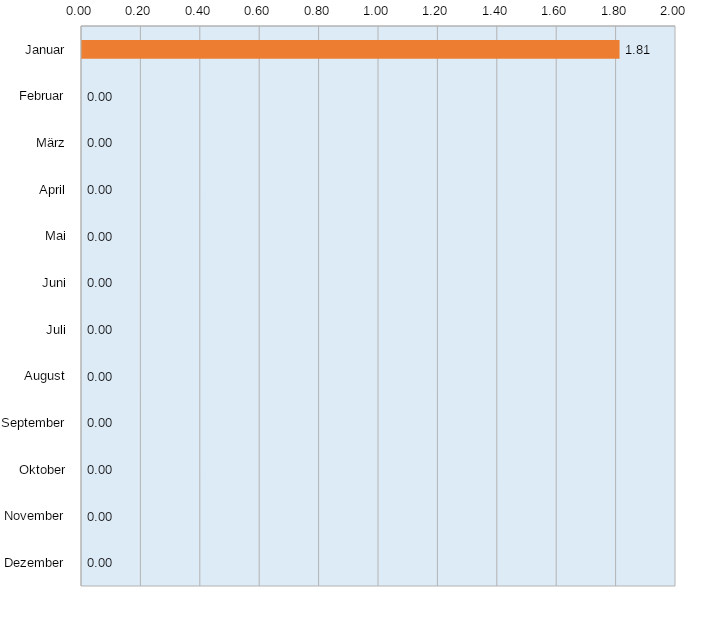
| Category | Werte im Ø |
|---|---|
| Januar | 1.81 |
| Februar | 0 |
| März | 0 |
| April | 0 |
| Mai | 0 |
| Juni | 0 |
| Juli | 0 |
| August | 0 |
| September | 0 |
| Oktober | 0 |
| November | 0 |
| Dezember | 0 |